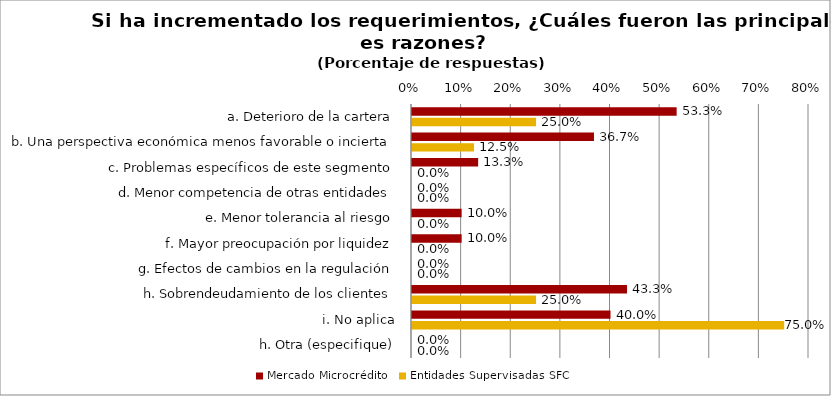
| Category | Mercado Microcrédito | Entidades Supervisadas SFC |
|---|---|---|
| a. Deterioro de la cartera | 0.533 | 0.25 |
| b. Una perspectiva económica menos favorable o incierta | 0.367 | 0.125 |
| c. Problemas específicos de este segmento | 0.133 | 0 |
| d. Menor competencia de otras entidades | 0 | 0 |
| e. Menor tolerancia al riesgo | 0.1 | 0 |
| f. Mayor preocupación por liquidez | 0.1 | 0 |
| g. Efectos de cambios en la regulación | 0 | 0 |
| h. Sobrendeudamiento de los clientes | 0.433 | 0.25 |
| i. No aplica | 0.4 | 0.75 |
| h. Otra (especifique) | 0 | 0 |